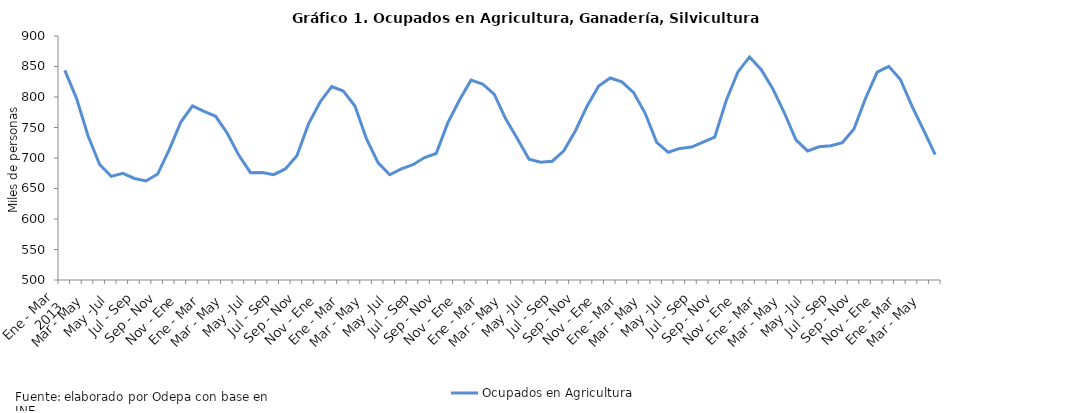
| Category | Ocupados en Agricultura |
|---|---|
| 0 | 843.658 |
| 1 | 798.266 |
| 2 | 736.461 |
| 3 | 689.358 |
| 4 | 669.839 |
| 5 | 674.791 |
| 6 | 666.406 |
| 7 | 662.262 |
| 8 | 673.724 |
| 9 | 713.604 |
| 10 | 758.988 |
| 11 | 785.537 |
| 12 | 776.373 |
| 13 | 768.303 |
| 14 | 740.609 |
| 15 | 704.367 |
| 16 | 675.938 |
| 17 | 676.058 |
| 18 | 672.6 |
| 19 | 682.074 |
| 20 | 703.599 |
| 21 | 755.905 |
| 22 | 791.902 |
| 23 | 817.027 |
| 24 | 809.646 |
| 25 | 785.301 |
| 26 | 731.282 |
| 27 | 691.978 |
| 28 | 672.526 |
| 29 | 682.164 |
| 30 | 689.034 |
| 31 | 700.719 |
| 32 | 707.439 |
| 33 | 757.522 |
| 34 | 794.669 |
| 35 | 827.605 |
| 36 | 821.367 |
| 37 | 804.582 |
| 38 | 763.826 |
| 39 | 731.558 |
| 40 | 698.04 |
| 41 | 692.989 |
| 42 | 694.776 |
| 43 | 711.757 |
| 44 | 744.739 |
| 45 | 785.03 |
| 46 | 818.051 |
| 47 | 831.11 |
| 48 | 824.789 |
| 49 | 807.606 |
| 50 | 773.662 |
| 51 | 725.597 |
| 52 | 709.369 |
| 53 | 715.675 |
| 54 | 717.856 |
| 55 | 725.965 |
| 56 | 734.277 |
| 57 | 794.66 |
| 58 | 841.147 |
| 59 | 865.659 |
| 60 | 845.074 |
| 61 | 813.586 |
| 62 | 774.131 |
| 63 | 729.695 |
| 64 | 711.581 |
| 65 | 718.419 |
| 66 | 720.091 |
| 67 | 725.105 |
| 68 | 747.425 |
| 69 | 798.027 |
| 70 | 840.667 |
| 71 | 850.292 |
| 72 | 828.766 |
| 73 | 785.1 |
| 74 | 745.744 |
| 75 | 705.675 |